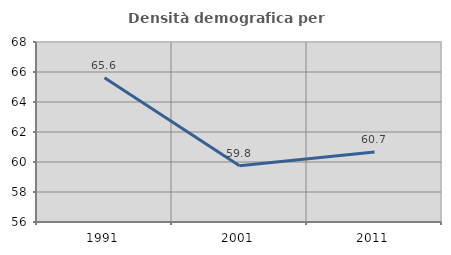
| Category | Densità demografica |
|---|---|
| 1991.0 | 65.613 |
| 2001.0 | 59.756 |
| 2011.0 | 60.672 |